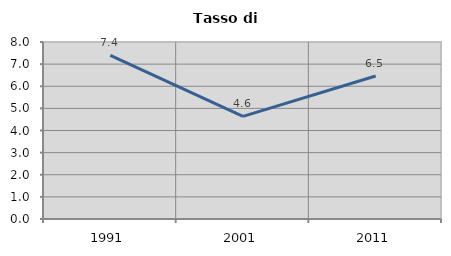
| Category | Tasso di disoccupazione   |
|---|---|
| 1991.0 | 7.392 |
| 2001.0 | 4.639 |
| 2011.0 | 6.466 |